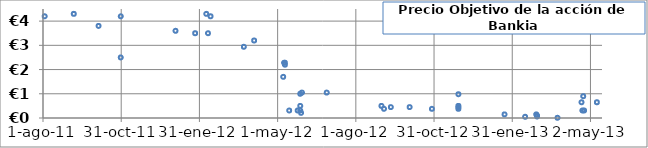
| Category | PRECIO OBJETIVO |
|---|---|
| 40758.0 | 4.2 |
| 40847.0 | 4.2 |
| 40952.0 | 4.2 |
| 41003.0 | 3.2 |
| 41059.0 | 1.05 |
| 41088.0 | 1.05 |
| 41163.0 | 0.45 |
| 41185.0 | 0.45 |
| 41242.0 | 0.45 |
| 41296.0 | 0.15 |
| 41333.0 | 0.15 |
| 41334.0 | 0.06 |
| 41358.0 | 0.009 |
| 41388.0 | 0.9 |
| 40792.0 | 4.3 |
| 40947.0 | 4.3 |
| 41039.0 | 2.2 |
| 41057.0 | 0.5 |
| 41152.0 | 0.5 |
| 41242.0 | 0.5 |
| 40821.0 | 3.8 |
| 40934.0 | 3.5 |
| 40949.0 | 3.5 |
| 41037.0 | 1.7 |
| 41044.0 | 0.31 |
| 41054.0 | 0.31 |
| 41057.0 | 0.31 |
| 41242.0 | 0.98 |
| 41418.0 | 0.45 |
| 41057.0 | 1 |
| 40991.0 | 2.94 |
| 41038.0 | 2.28 |
| 41039.0 | 2.28 |
| 41058.0 | 0.21 |
| 41155.0 | 0.38 |
| 41211.0 | 0.38 |
| 41242.0 | 0.38 |
| 41334.0 | 0.1 |
| 41387.0 | 0.31 |
| 41389.0 | 0.31 |
| 40751.0 | 2.5 |
| 40847.0 | 2.5 |
| 40911.0 | 3.6 |
| 41320.0 | 0.05 |
| 41386.0 | 0.65 |
| 41404.0 | 0.65 |